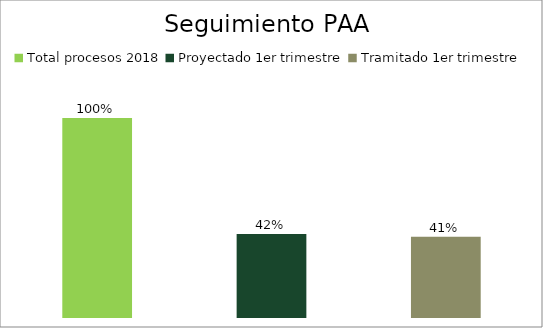
| Category | Total procesos 2018 |
|---|---|
| Total procesos 2018 | 1 |
| Proyectado 1er trimestre | 0.42 |
| Tramitado 1er trimestre | 0.406 |